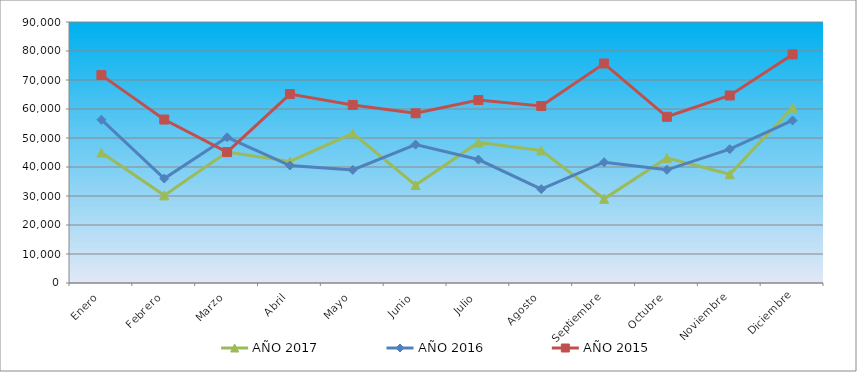
| Category | AÑO 2017 | AÑO 2016 | AÑO 2015 |
|---|---|---|---|
| Enero | 44978 | 56304 | 71684 |
| Febrero | 30220 | 36029 | 56369 |
| Marzo | 45185 | 50251 | 45129 |
| Abril | 41904 | 40516 | 65139 |
| Mayo | 51621 | 39002 | 61404 |
| Junio | 33778 | 47731 | 58515 |
| Julio | 48484 | 42570 | 63107 |
| Agosto | 45724 | 32376 | 61032 |
| Septiembre | 29035 | 41660 | 75687 |
| Octubre | 43136 | 39034 | 57314 |
| Noviembre | 37488 | 46134 | 64659 |
| Diciembre | 60445 | 56059 | 78827 |